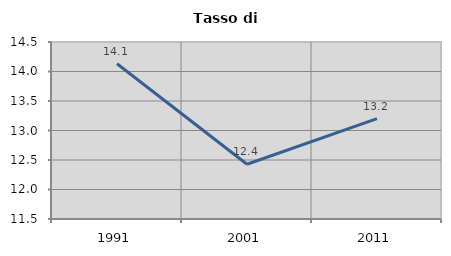
| Category | Tasso di disoccupazione   |
|---|---|
| 1991.0 | 14.13 |
| 2001.0 | 12.429 |
| 2011.0 | 13.202 |